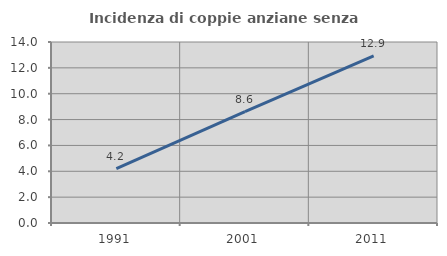
| Category | Incidenza di coppie anziane senza figli  |
|---|---|
| 1991.0 | 4.208 |
| 2001.0 | 8.617 |
| 2011.0 | 12.927 |